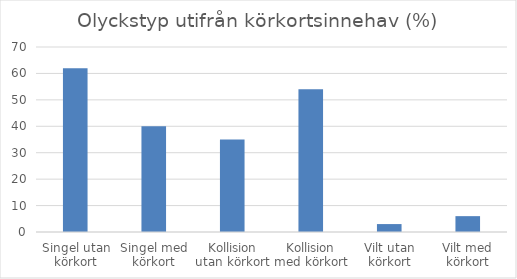
| Category | Andel (%) |
|---|---|
| Singel utan körkort | 62 |
| Singel med körkort | 40 |
| Kollision utan körkort | 35 |
| Kollision med körkort | 54 |
| Vilt utan körkort | 3 |
| Vilt med körkort | 6 |